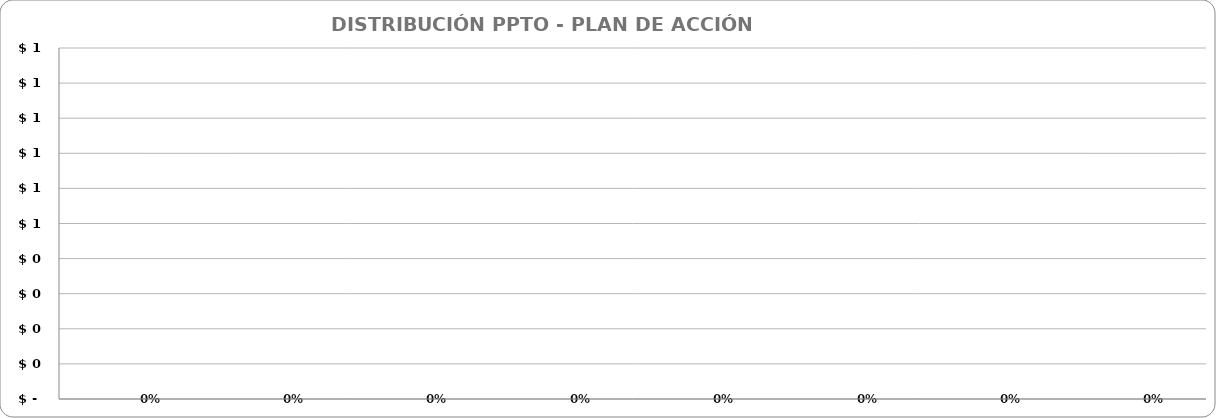
| Category | TOTAL |
|---|---|
|  | 0 |
|  | 0 |
|  | 0 |
|  | 0 |
|  | 0 |
|  | 0 |
|  | 0 |
|  | 0 |